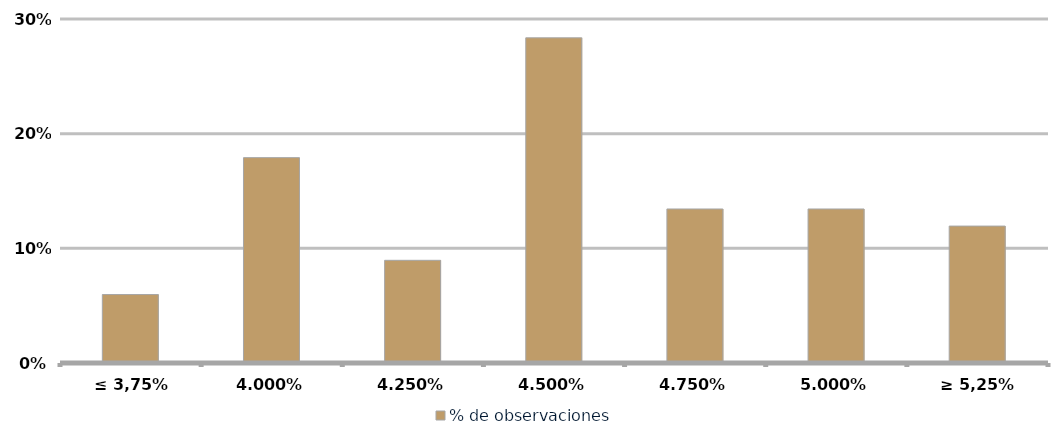
| Category | % de observaciones  |
|---|---|
| ≤ 3,75% | 0.06 |
| 4,00% | 0.179 |
| 4,25% | 0.09 |
| 4,50% | 0.284 |
| 4,75% | 0.134 |
| 5,00% | 0.134 |
| ≥ 5,25% | 0.119 |